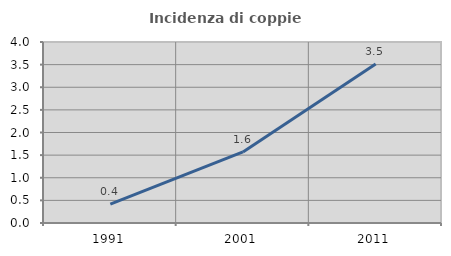
| Category | Incidenza di coppie miste |
|---|---|
| 1991.0 | 0.416 |
| 2001.0 | 1.571 |
| 2011.0 | 3.516 |